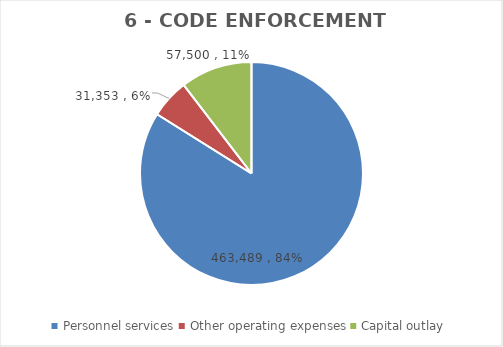
| Category | Series 0 | Series 1 | Series 2 | Series 3 | Series 4 | Series 5 | Series 6 |
|---|---|---|---|---|---|---|---|
| Personnel services | 463489 |  |  | 474488 | 460843 | 463489 | 463489 |
| Other operating expenses | 31353 |  |  | 18268 | 30957 | 31353 | 31353 |
| Capital outlay | 57500 |  |  | 0 | 2500 | 57500 | 57500 |